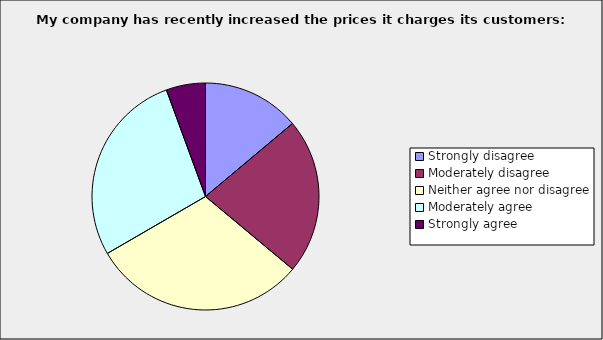
| Category | Series 0 |
|---|---|
| Strongly disagree | 0.139 |
| Moderately disagree | 0.222 |
| Neither agree nor disagree | 0.306 |
| Moderately agree | 0.278 |
| Strongly agree | 0.056 |